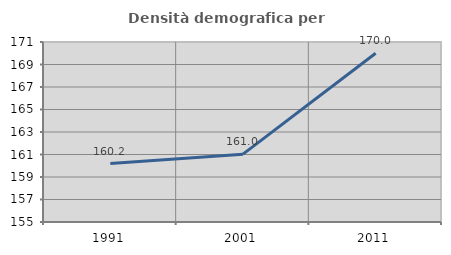
| Category | Densità demografica |
|---|---|
| 1991.0 | 160.193 |
| 2001.0 | 161.033 |
| 2011.0 | 169.995 |